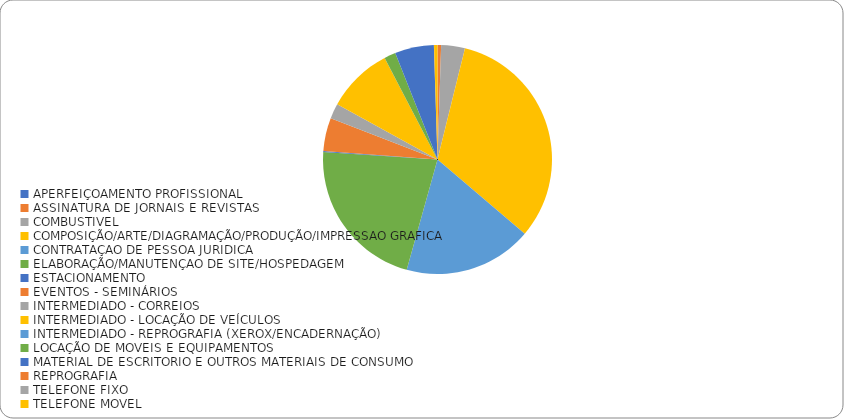
| Category | Series 0 |
|---|---|
| APERFEIÇOAMENTO PROFISSIONAL | 0 |
| ASSINATURA DE JORNAIS E REVISTAS | 1299.1 |
| COMBUSTIVEL | 8583.64 |
| COMPOSIÇÃO/ARTE/DIAGRAMAÇÃO/PRODUÇÃO/IMPRESSAO GRAFICA | 82759 |
| CONTRATAÇAO DE PESSOA JURIDICA | 46350 |
| ELABORAÇÃO/MANUTENÇAO DE SITE/HOSPEDAGEM | 55500 |
| ESTACIONAMENTO | 395 |
| EVENTOS - SEMINÁRIOS | 11990.62 |
| INTERMEDIADO - CORREIOS | 5464.53 |
| INTERMEDIADO - LOCAÇÃO DE VEÍCULOS | 23917.9 |
| INTERMEDIADO - REPROGRAFIA (XEROX/ENCADERNAÇÃO) | 18.48 |
| LOCAÇÃO DE MOVEIS E EQUIPAMENTOS | 4140 |
| MATERIAL DE ESCRITORIO E OUTROS MATERIAIS DE CONSUMO | 14089.06 |
| REPROGRAFIA | 62.5 |
| TELEFONE FIXO | 0 |
| TELEFONE MOVEL | 1234.27 |